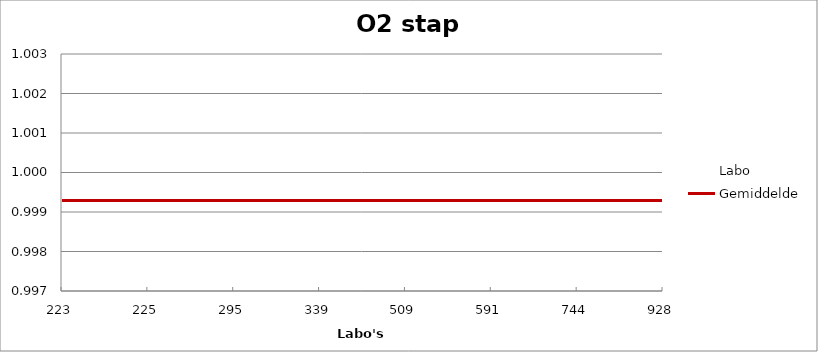
| Category | Labo | Gemiddelde |
|---|---|---|
| 223.0 | 1 | 0.999 |
| 225.0 | 1 | 0.999 |
| 295.0 | 1 | 0.999 |
| 339.0 | 1 | 0.999 |
| 509.0 | 0.998 | 0.999 |
| 591.0 | 1.001 | 0.999 |
| 744.0 | 0.998 | 0.999 |
| 928.0 | 0.998 | 0.999 |